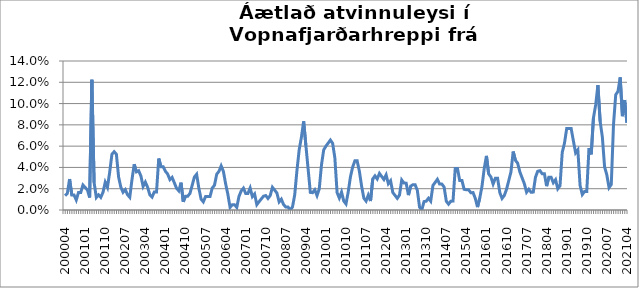
| Category | Series 0 |
|---|---|
| 200004 | 0.013 |
| 200005 | 0.016 |
| 200006 | 0.029 |
| 200007 | 0.014 |
| 200008 | 0.014 |
| 200009 | 0.009 |
| 200010 | 0.016 |
| 200011 | 0.016 |
| 200012 | 0.023 |
| 200101 | 0.021 |
| 200102 | 0.019 |
| 200103 | 0.012 |
| 200104 | 0.122 |
| 200105 | 0.026 |
| 200106 | 0.012 |
| 200107 | 0.014 |
| 200108 | 0.012 |
| 200109 | 0.017 |
| 200110 | 0.026 |
| 200111 | 0.021 |
| 200112 | 0.036 |
| 200201 | 0.052 |
| 200202 | 0.055 |
| 200203 | 0.052 |
| 200204 | 0.031 |
| 200205 | 0.021 |
| 200206 | 0.017 |
| 200207 | 0.019 |
| 200208 | 0.014 |
| 200209 | 0.012 |
| 200210 | 0.029 |
| 200211 | 0.043 |
| 200212 | 0.036 |
| 200301 | 0.037 |
| 200302 | 0.032 |
| 200303 | 0.022 |
| 200304 | 0.026 |
| 200305 | 0.021 |
| 200306 | 0.014 |
| 200307 | 0.012 |
| 200308 | 0.017 |
| 200309 | 0.017 |
| 200310 | 0.048 |
| 200311 | 0.041 |
| 200312 | 0.041 |
| 200401 | 0.036 |
| 200402 | 0.034 |
| 200403 | 0.029 |
| 200404 | 0.031 |
| 200405 | 0.026 |
| 200406 | 0.02 |
| 200407 | 0.018 |
| 200408 | 0.026 |
| 200409 | 0.008 |
| 200410 | 0.013 |
| 200411 | 0.013 |
| 200412 | 0.016 |
| 200501 | 0.023 |
| 200502 | 0.031 |
| 200503 | 0.034 |
| 200504 | 0.02 |
| 200505 | 0.01 |
| 200506 | 0.008 |
| 200507 | 0.013 |
| 200508 | 0.013 |
| 200509 | 0.013 |
| 200510 | 0.021 |
| 200511 | 0.023 |
| 200512 | 0.034 |
| 200601 | 0.036 |
| 200602 | 0.041 |
| 200603 | 0.036 |
| 200604 | 0.025 |
| 200605 | 0.015 |
| 200606 | 0.002 |
| 200607 | 0.005 |
| 200608 | 0.005 |
| 200609 | 0.002 |
| 200610 | 0.013 |
| 200611 | 0.018 |
| 200612 | 0.021 |
| 200701 | 0.016 |
| 200702 | 0.016 |
| 200703 | 0.021 |
| 200704 | 0.013 |
| 200705 | 0.015 |
| 200706 | 0.005 |
| 200707 | 0.008 |
| 200708 | 0.01 |
| 200709 | 0.013 |
| 200710 | 0.014 |
| 200711 | 0.011 |
| 200712 | 0.014 |
| 200801 | 0.021 |
| 200802 | 0.019 |
| 200803 | 0.016 |
| 200804 | 0.008 |
| 200805 | 0.01 |
| 200806 | 0.005 |
| 200807 | 0.003 |
| 200808 | 0.003 |
| 200809 | 0 |
| 200810 | 0.003 |
| 200811 | 0.014 |
| 200812 | 0.037 |
| 200901 | 0.057 |
| 200902 | 0.068 |
| 200903 | 0.083 |
| 200904 | 0.061 |
| 200905 | 0.039 |
| 200906 | 0.017 |
| 200907 | 0.016 |
| 200908 | 0.019 |
| 200909 | 0.014 |
| 200910 | 0.02 |
| 200911 | 0.042 |
| 200912 | 0.056 |
| 201001 | 0.06 |
| 201002 | 0.063 |
| 201003 | 0.066 |
| 201004 | 0.063 |
| 201005 | 0.049 |
| 201006 | 0.016 |
| 201007 | 0.011 |
| 201008 | 0.017 |
| 201009 | 0.008 |
| 201010 | 0.006 |
| 201011 | 0.017 |
| 201012 | 0.031 |
| 201101 | 0.04 |
| 201102 | 0.046 |
| 201103 | 0.046 |
| 201104 | 0.036 |
| 201105 | 0.022 |
| 201106 | 0.011 |
| 201107 | 0.008 |
| 201108 | 0.014 |
| 201109 | 0.008 |
| 201110 | 0.029 |
| 201111 | 0.032 |
| 201112 | 0.029 |
| 201201 | 0.034 |
| 201202 | 0.032 |
| 201203 | 0.029 |
| 201204 | 0.033 |
| 201205 | 0.025 |
| 201206 | 0.027 |
| 201207 | 0.016 |
| 201208 | 0.014 |
| 201209 | 0.011 |
| 201210 | 0.014 |
| 201211 | 0.028 |
| 201212 | 0.025 |
| 201301 | 0.025 |
| 201302 | 0.014 |
| 201303 | 0.022 |
| 201304 | 0.024 |
| 201305 | 0.024 |
| 201306 | 0.018 |
| 201307 | 0.003 |
| 201308 | 0 |
| 201309 | 0.008 |
| 201310 | 0.008 |
| 201311 | 0.011 |
| 201312 | 0.008 |
| 201401 | 0.023 |
| 201402 | 0.026 |
| 201403 | 0.029 |
| 201404 | 0.024 |
| 201405 | 0.024 |
| 201406 | 0.022 |
| 201407 | 0.008 |
| 201408 | 0.005 |
| 201409 | 0.008 |
| 201410 | 0.008 |
| 201411 | 0.039 |
| 201412 | 0.039 |
| 201501 | 0.028 |
| 201502 | 0.028 |
| 201503 | 0.019 |
| 201504 | 0.019 |
| 201505 | 0.019 |
| 201506 | 0.016 |
| 201507 | 0.016 |
| 201508 | 0.011 |
| 201509 | 0.003 |
| 201510 | 0.011 |
| 201511 | 0.022 |
| 201512 | 0.039 |
| 201601 | 0.051 |
| 201602 | 0.034 |
| 201603 | 0.031 |
| 201604 | 0.024 |
| 201605 | 0.03 |
| 201606 | 0.03 |
| 201607 | 0.016 |
| 201608 | 0.011 |
| 201609 | 0.014 |
| 201610 | 0.019 |
| 201611 | 0.028 |
| 201612 | 0.036 |
| 201701 | 0.055 |
| 201702 | 0.047 |
| 201703 | 0.044 |
| 201704 | 0.036 |
| 201705 | 0.03 |
| 201706 | 0.025 |
| 201707 | 0.017 |
| 201708 | 0.019 |
| 201709 | 0.017 |
| 201710 | 0.017 |
| 201711 | 0.031 |
| 201712 | 0.036 |
| 201801 | 0.037 |
| 201802 | 0.034 |
| 201803 | 0.034 |
| 201804 | 0.022 |
| 201805 | 0.031 |
| 201806 | 0.031 |
| 201807 | 0.026 |
| 201808 | 0.028 |
| 201809 | 0.02 |
| 201810 | 0.023 |
| 201811 | 0.054 |
| 201812 | 0.063 |
| 201901 | 0.076 |
| 201902 | 0.076 |
| 201903 | 0.076 |
| 201904 | 0.065 |
| 201905 | 0.054 |
| 201906 | 0.056 |
| 201907 | 0.023 |
| 201908 | 0.014 |
| 201909 | 0.017 |
| 201910 | 0.017 |
| 201911 | 0.058 |
| 201912 | 0.052 |
| 202001 | 0.086 |
| 202002 | 0.099 |
| 202003*** | 0.117 |
| 202004 | 0.083 |
| 202005 | 0.069 |
| 202006 | 0.04 |
| 202007 | 0.033 |
| 202008 | 0.021 |
| 202009 | 0.024 |
| 202010 | 0.08 |
| 202011 | 0.108 |
| 202012 | 0.111 |
| 202101 | 0.125 |
| 202102 | 0.088 |
| 202103 | 0.103 |
| 202104 | 0.082 |